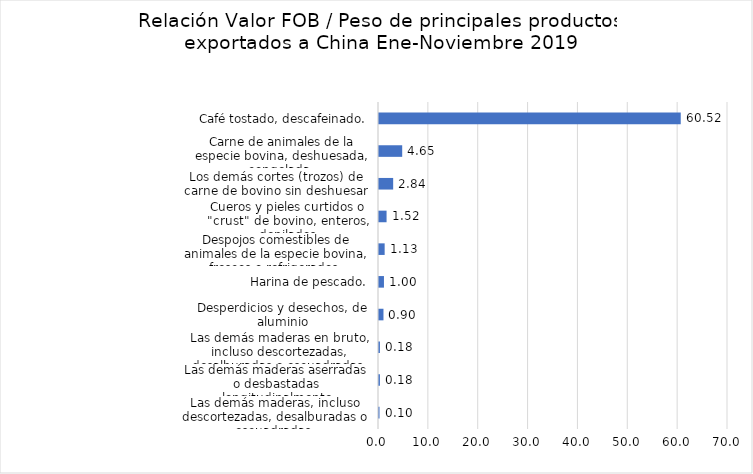
| Category | Series 0 |
|---|---|
| Las demás maderas, incluso descortezadas, desalburadas o escuadradas  | 0.103 |
| Las demás maderas aserradas o desbastadas longitudinalmente | 0.183 |
| Las demás maderas en bruto, incluso descortezadas, desalburadas o escuadradas. | 0.183 |
| Desperdicios y desechos, de aluminio | 0.897 |
| Harina de pescado. | 0.995 |
| Despojos comestibles de animales de la especie bovina, frescos o refrigerados. | 1.135 |
| Cueros y pieles curtidos o "crust" de bovino, enteros, depilados | 1.519 |
| Los demás cortes (trozos) de carne de bovino sin deshuesar | 2.842 |
| Carne de animales de la especie bovina, deshuesada, congelada. | 4.654 |
| Café tostado, descafeinado. | 60.521 |